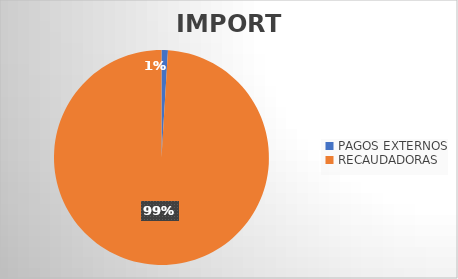
| Category | IMPORTE |
|---|---|
| PAGOS EXTERNOS | 1476501.53 |
| RECAUDADORAS | 152357002.37 |